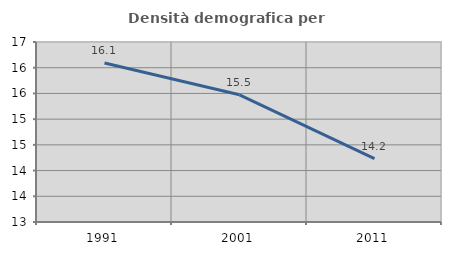
| Category | Densità demografica |
|---|---|
| 1991.0 | 16.093 |
| 2001.0 | 15.473 |
| 2011.0 | 14.233 |